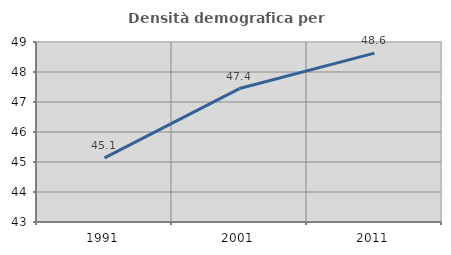
| Category | Densità demografica |
|---|---|
| 1991.0 | 45.14 |
| 2001.0 | 47.448 |
| 2011.0 | 48.629 |